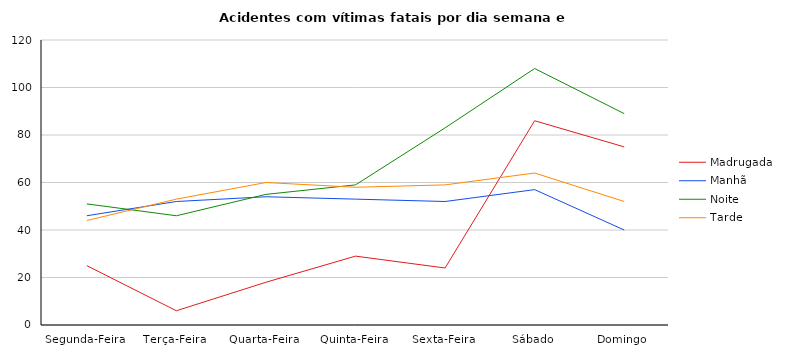
| Category | Madrugada | Manhã | Noite | Tarde |
|---|---|---|---|---|
| Segunda-Feira | 25 | 46 | 51 | 44 |
| Terça-Feira | 6 | 52 | 46 | 53 |
| Quarta-Feira | 18 | 54 | 55 | 60 |
| Quinta-Feira | 29 | 53 | 59 | 58 |
| Sexta-Feira | 24 | 52 | 83 | 59 |
| Sábado | 86 | 57 | 108 | 64 |
| Domingo | 75 | 40 | 89 | 52 |